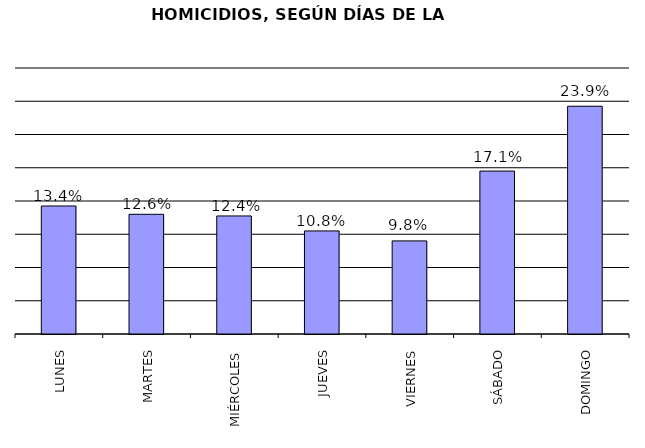
| Category | LUNES |
|---|---|
| LUNES | 77 |
| MARTES | 72 |
| MIÉRCOLES | 71 |
| JUEVES | 62 |
| VIERNES | 56 |
| SÁBADO | 98 |
| DOMINGO | 137 |